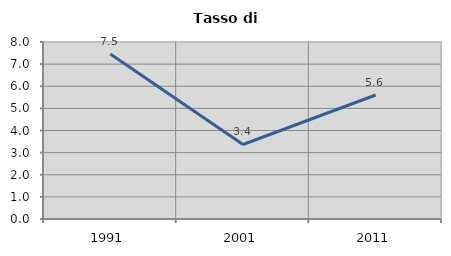
| Category | Tasso di disoccupazione   |
|---|---|
| 1991.0 | 7.453 |
| 2001.0 | 3.369 |
| 2011.0 | 5.604 |